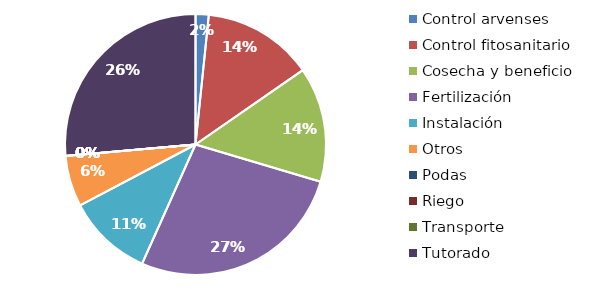
| Category | Valor |
|---|---|
| Control arvenses | 272328 |
| Control fitosanitario | 2286991 |
| Cosecha y beneficio | 2376612.266 |
| Fertilización | 4517713 |
| Instalación | 1760453.53 |
| Otros | 1056272 |
| Podas | 0 |
| Riego | 0 |
| Transporte | 0 |
| Tutorado | 4401134 |